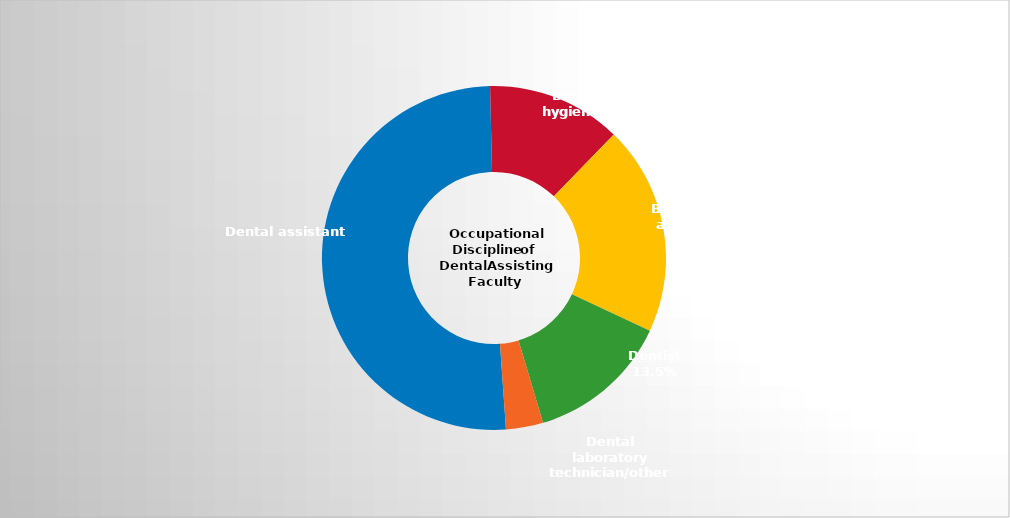
| Category | Series 2 |
|---|---|
| Dental assistant   | 0.507 |
| Dental hygienist | 0.126 |
| Both dental hygienist and dental assistant | 0.197 |
| Dentist | 0.135 |
| Dental laboratory technician/other | 0.035 |